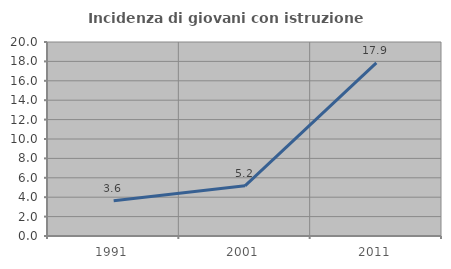
| Category | Incidenza di giovani con istruzione universitaria |
|---|---|
| 1991.0 | 3.636 |
| 2001.0 | 5.172 |
| 2011.0 | 17.857 |